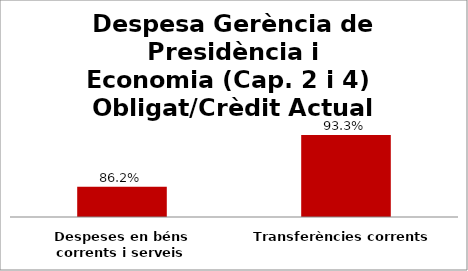
| Category | Series 0 |
|---|---|
| Despeses en béns corrents i serveis | 0.862 |
| Transferències corrents | 0.933 |